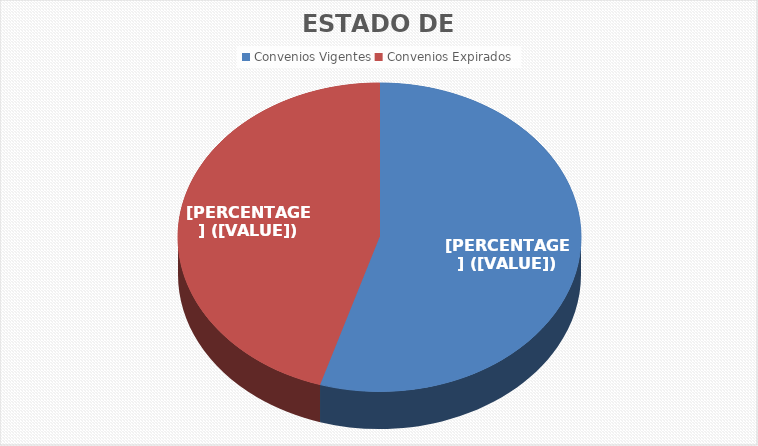
| Category | Series 0 | Series 1 |
|---|---|---|
| Convenios Vigentes | 213 | 0.548 |
| Convenios Expirados | 176 | 0.452 |